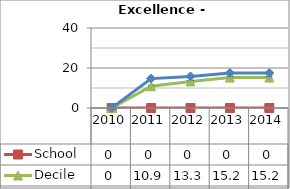
| Category | School  | Decile | National |
|---|---|---|---|
| 2010.0 | 0 | 0 | 0 |
| 2011.0 | 0 | 10.9 | 14.7 |
| 2012.0 | 0 | 13.3 | 15.8 |
| 2013.0 | 0 | 15.2 | 17.5 |
| 2014.0 | 0 | 15.2 | 17.5 |